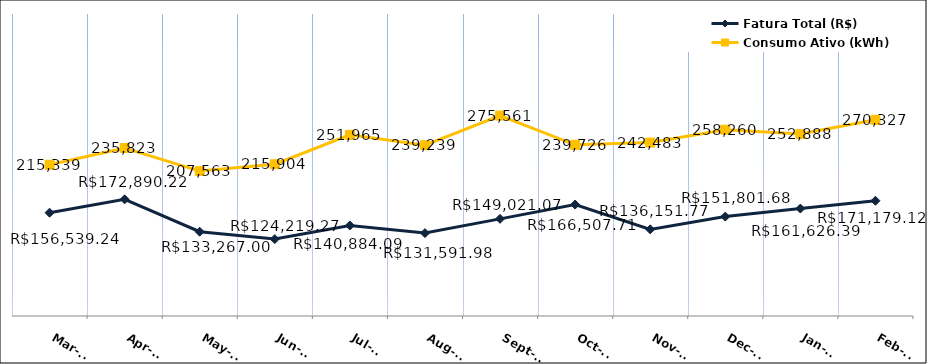
| Category | Fatura Total (R$) |
|---|---|
| 2022-03-01 | 156539.24 |
| 2022-04-01 | 172890.22 |
| 2022-05-01 | 133267 |
| 2022-06-01 | 124219.27 |
| 2022-07-01 | 140884.09 |
| 2022-08-01 | 131591.98 |
| 2022-09-01 | 149021.07 |
| 2022-10-01 | 166507.71 |
| 2022-11-01 | 136151.77 |
| 2022-12-01 | 151801.68 |
| 2023-01-01 | 161626.39 |
| 2023-02-01 | 171179.12 |